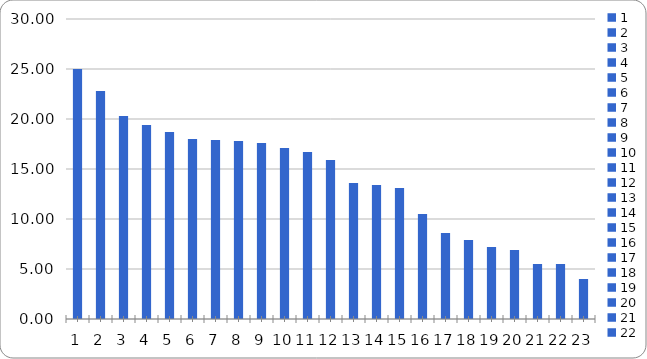
| Category | Series 0 |
|---|---|
| 0 | 25 |
| 1 | 22.8 |
| 2 | 20.3 |
| 3 | 19.4 |
| 4 | 18.7 |
| 5 | 18 |
| 6 | 17.9 |
| 7 | 17.8 |
| 8 | 17.6 |
| 9 | 17.1 |
| 10 | 16.7 |
| 11 | 15.9 |
| 12 | 13.6 |
| 13 | 13.4 |
| 14 | 13.1 |
| 15 | 10.5 |
| 16 | 8.6 |
| 17 | 7.9 |
| 18 | 7.2 |
| 19 | 6.9 |
| 20 | 5.5 |
| 21 | 5.5 |
| 22 | 4 |